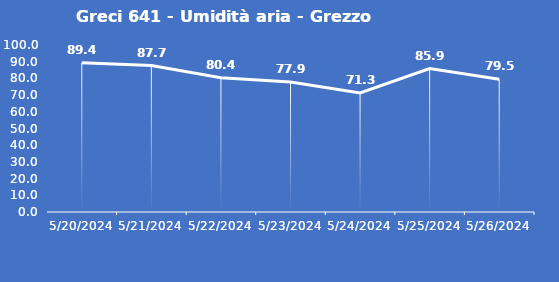
| Category | Greci 641 - Umidità aria - Grezzo (%) |
|---|---|
| 5/20/24 | 89.4 |
| 5/21/24 | 87.7 |
| 5/22/24 | 80.4 |
| 5/23/24 | 77.9 |
| 5/24/24 | 71.3 |
| 5/25/24 | 85.9 |
| 5/26/24 | 79.5 |